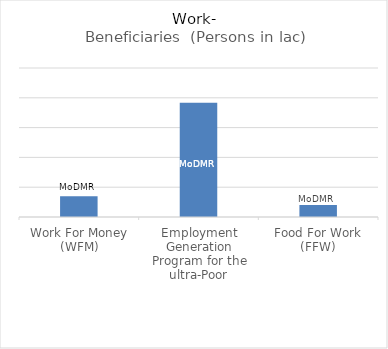
| Category | Beneficiaries  (Persons in lac) |
|---|---|
| Work For Money (WFM) | 3.5 |
| Employment Generation Program for the ultra-Poor | 19.18 |
| Food For Work (FFW) | 2 |